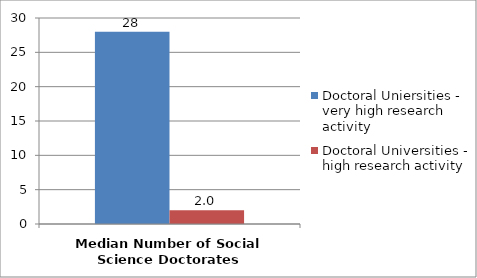
| Category | Doctoral Uniersities - very high research activity | Doctoral Universities - high research activity |
|---|---|---|
| 0 | 28 | 2 |